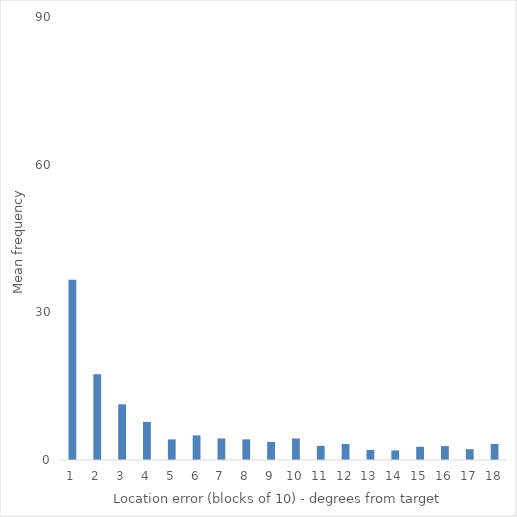
| Category | Average |
|---|---|
| 0 | 36.625 |
| 1 | 17.438 |
| 2 | 11.312 |
| 3 | 7.75 |
| 4 | 4.188 |
| 5 | 5 |
| 6 | 4.375 |
| 7 | 4.188 |
| 8 | 3.688 |
| 9 | 4.375 |
| 10 | 2.875 |
| 11 | 3.25 |
| 12 | 2.062 |
| 13 | 1.938 |
| 14 | 2.688 |
| 15 | 2.812 |
| 16 | 2.188 |
| 17 | 3.25 |